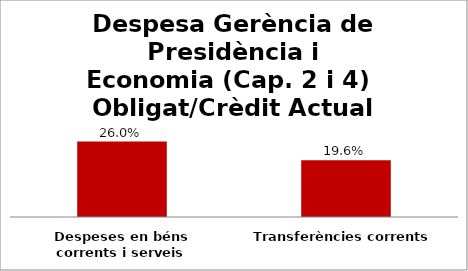
| Category | Series 0 |
|---|---|
| Despeses en béns corrents i serveis | 0.26 |
| Transferències corrents | 0.196 |